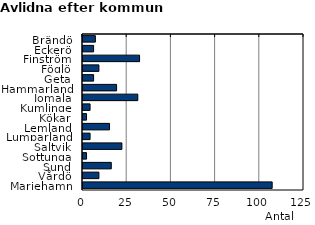
| Category | Series 0 |
|---|---|
| Brändö | 7 |
| Eckerö | 6 |
| Finström | 32 |
| Föglö | 9 |
| Geta | 6 |
| Hammarland | 19 |
| Jomala | 31 |
| Kumlinge | 4 |
| Kökar | 2 |
| Lemland | 15 |
| Lumparland | 4 |
| Saltvik | 22 |
| Sottunga | 2 |
| Sund | 16 |
| Vårdö | 9 |
| Mariehamn | 107 |